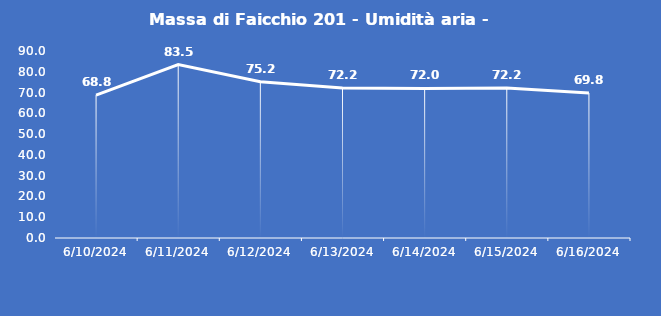
| Category | Massa di Faicchio 201 - Umidità aria - Grezzo (%) |
|---|---|
| 6/10/24 | 68.8 |
| 6/11/24 | 83.5 |
| 6/12/24 | 75.2 |
| 6/13/24 | 72.2 |
| 6/14/24 | 72 |
| 6/15/24 | 72.2 |
| 6/16/24 | 69.8 |